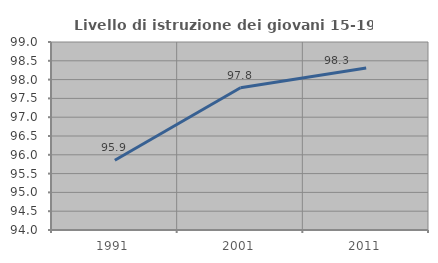
| Category | Livello di istruzione dei giovani 15-19 anni |
|---|---|
| 1991.0 | 95.855 |
| 2001.0 | 97.783 |
| 2011.0 | 98.309 |